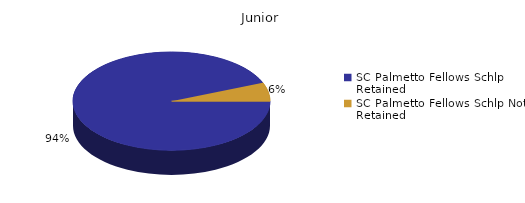
| Category | Junior |
|---|---|
| SC Palmetto Fellows Schlp Retained  | 553 |
| SC Palmetto Fellows Schlp Not Retained  | 36 |